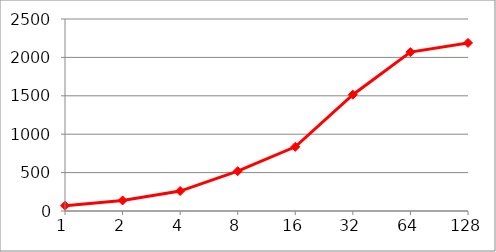
| Category | Series 0 |
|---|---|
| 1.0 | 68.552 |
| 2.0 | 137.505 |
| 4.0 | 259.822 |
| 8.0 | 518.268 |
| 16.0 | 835.427 |
| 32.0 | 1514.666 |
| 64.0 | 2068.464 |
| 128.0 | 2188.49 |